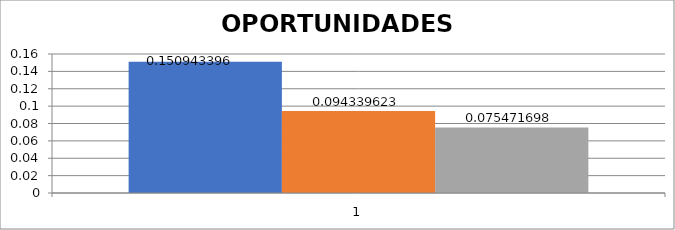
| Category | Acceso a tecnología de ultima generación | Oferta de programas de capacitación ofrecidos por instituciones públicas y/o privadas. | Existencia de normatividad que permite el direccionamiento y detalle de las actividades a desarrollar en el proceso. |
|---|---|---|---|
| 0 | 0.151 | 0.094 | 0.075 |